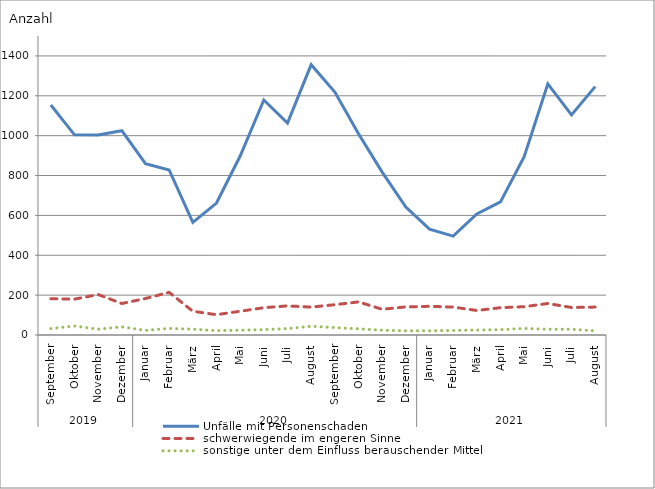
| Category | Unfälle mit Personenschaden | schwerwiegende im engeren Sinne | sonstige unter dem Einfluss berauschender Mittel |
|---|---|---|---|
| 0 | 1154 | 182 | 32 |
| 1 | 1004 | 180 | 45 |
| 2 | 1003 | 203 | 29 |
| 3 | 1025 | 158 | 41 |
| 4 | 860 | 183 | 23 |
| 5 | 828 | 214 | 33 |
| 6 | 565 | 119 | 29 |
| 7 | 662 | 102 | 22 |
| 8 | 898 | 119 | 24 |
| 9 | 1179 | 137 | 27 |
| 10 | 1063 | 146 | 32 |
| 11 | 1356 | 140 | 44 |
| 12 | 1219 | 152 | 37 |
| 13 | 1010 | 166 | 31 |
| 14 | 817 | 129 | 24 |
| 15 | 642 | 141 | 21 |
| 16 | 531 | 144 | 21 |
| 17 | 496 | 140 | 23 |
| 18 | 607 | 123 | 25 |
| 19 | 668 | 137 | 27 |
| 20 | 895 | 142 | 33 |
| 21 | 1260 | 158 | 29 |
| 22 | 1104 | 138 | 29 |
| 23 | 1246 | 140 | 21 |